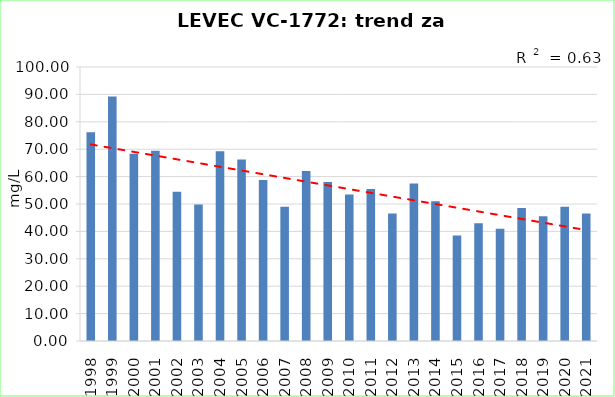
| Category | Vsota |
|---|---|
| 1998 | 76.15 |
| 1999 | 89.25 |
| 2000 | 68.3 |
| 2001 | 69.4 |
| 2002 | 54.45 |
| 2003 | 49.8 |
| 2004 | 69.233 |
| 2005 | 66.267 |
| 2006 | 58.75 |
| 2007 | 49 |
| 2008 | 62 |
| 2009 | 58 |
| 2010 | 53.5 |
| 2011 | 55.5 |
| 2012 | 46.5 |
| 2013 | 57.5 |
| 2014 | 51 |
| 2015 | 38.5 |
| 2016 | 43 |
| 2017 | 41 |
| 2018 | 48.5 |
| 2019 | 45.5 |
| 2020 | 49 |
| 2021 | 46.5 |